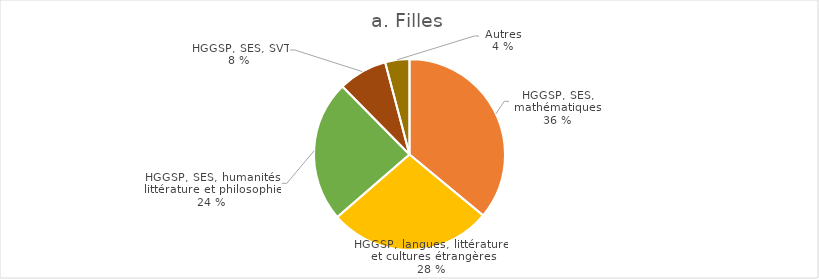
| Category | Filles |
|---|---|
| HGGSP, SES, mathématiques | 11378 |
| HGGSP, SES, LLCER | 8733 |
| HGGSP, SES, humanités, littérature et philosophie | 7573 |
| HGGSP, SES, SVT | 2620 |
| Autres | 1299 |